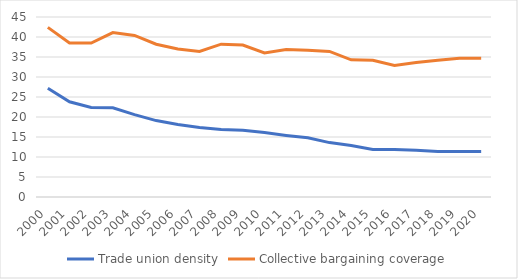
| Category | Trade union density | Collective bargaining coverage |
|---|---|---|
| 2000.0 | 27.2 | 42.4 |
| 2001.0 | 23.8 | 38.5 |
| 2002.0 | 22.4 | 38.5 |
| 2003.0 | 22.3 | 41.1 |
| 2004.0 | 20.6 | 40.4 |
| 2005.0 | 19.1 | 38.2 |
| 2006.0 | 18.1 | 37 |
| 2007.0 | 17.4 | 36.4 |
| 2008.0 | 16.9 | 38.2 |
| 2009.0 | 16.7 | 38 |
| 2010.0 | 16.1 | 36 |
| 2011.0 | 15.4 | 36.9 |
| 2012.0 | 14.8 | 36.7 |
| 2013.0 | 13.6 | 36.4 |
| 2014.0 | 12.9 | 34.3 |
| 2015.0 | 11.9 | 34.2 |
| 2016.0 | 11.9 | 32.9 |
| 2017.0 | 11.7 | 33.6 |
| 2018.0 | 11.4 | 34.2 |
| 2019.0 | 11.4 | 34.7 |
| 2020.0 | 11.4 | 34.7 |